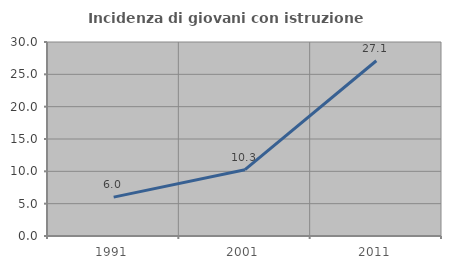
| Category | Incidenza di giovani con istruzione universitaria |
|---|---|
| 1991.0 | 6.011 |
| 2001.0 | 10.256 |
| 2011.0 | 27.103 |